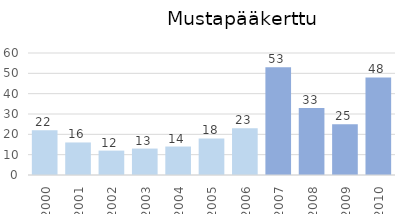
| Category | Series 0 |
|---|---|
| 2000.0 | 22 |
| 2001.0 | 16 |
| 2002.0 | 12 |
| 2003.0 | 13 |
| 2004.0 | 14 |
| 2005.0 | 18 |
| 2006.0 | 23 |
| 2007.0 | 53 |
| 2008.0 | 33 |
| 2009.0 | 25 |
| 2010.0 | 48 |